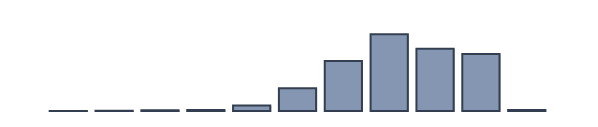
| Category | Series 0 |
|---|---|
| 0 | 0 |
| 1 | 0.043 |
| 2 | 0.13 |
| 3 | 0.261 |
| 4 | 0.348 |
| 5 | 2 |
| 6 | 8.217 |
| 7 | 18 |
| 8 | 27.652 |
| 9 | 22.435 |
| 10 | 20.565 |
| 11 | 0.348 |
| 12 | 0 |